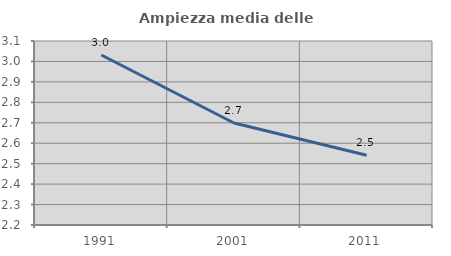
| Category | Ampiezza media delle famiglie |
|---|---|
| 1991.0 | 3.031 |
| 2001.0 | 2.699 |
| 2011.0 | 2.541 |